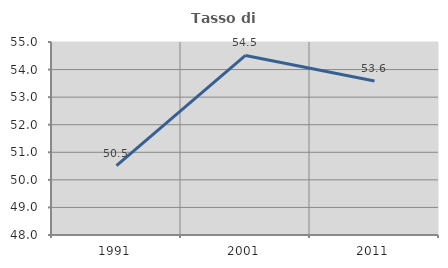
| Category | Tasso di occupazione   |
|---|---|
| 1991.0 | 50.517 |
| 2001.0 | 54.511 |
| 2011.0 | 53.585 |